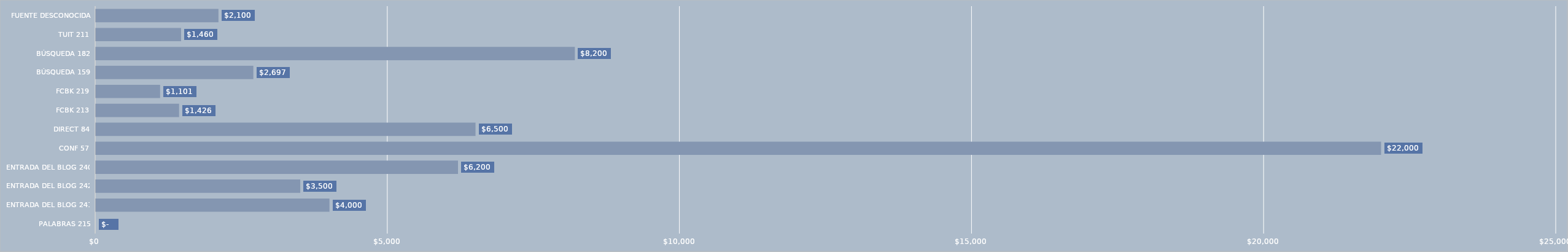
| Category | Series 0 |
|---|---|
| Palabras 215 | 0 |
| ENTRADA DEL BLOG 241 | 4000 |
| ENTRADA DEL BLOG 242 | 3500 |
| ENTRADA DEL BLOG 240 | 6200 |
| CONF 57 | 22000 |
| DIRECT 84 | 6500 |
| FCBK 213 | 1426 |
| FCBK 219 | 1101 |
| BÚSQUEDA 159 | 2697 |
| BÚSQUEDA 182 | 8200 |
| TUIT 211 | 1460 |
| FUENTE DESCONOCIDA | 2100 |